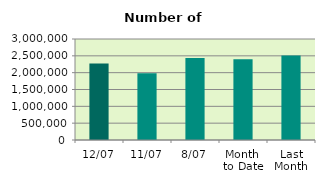
| Category | Series 0 |
|---|---|
| 12/07 | 2272422 |
| 11/07 | 1981416 |
| 8/07 | 2436822 |
| Month 
to Date | 2398108.75 |
| Last
Month | 2507488.545 |